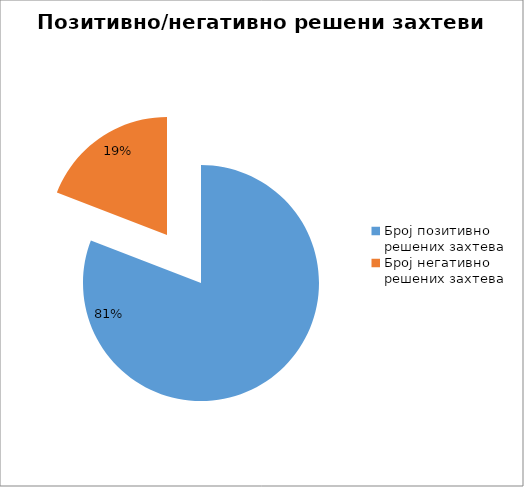
| Category | Series 0 |
|---|---|
| Број позитивно решених захтева | 35759 |
| Број негативно решених захтева | 8471 |